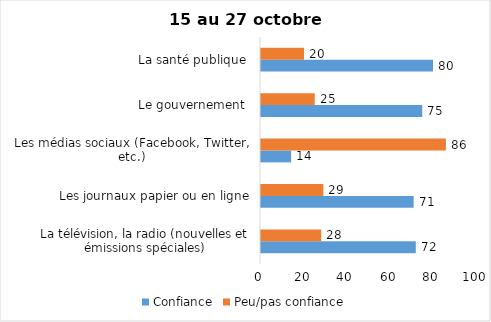
| Category | Confiance | Peu/pas confiance |
|---|---|---|
| La télévision, la radio (nouvelles et émissions spéciales) | 72 | 28 |
| Les journaux papier ou en ligne | 71 | 29 |
| Les médias sociaux (Facebook, Twitter, etc.) | 14 | 86 |
| Le gouvernement  | 75 | 25 |
| La santé publique  | 80 | 20 |